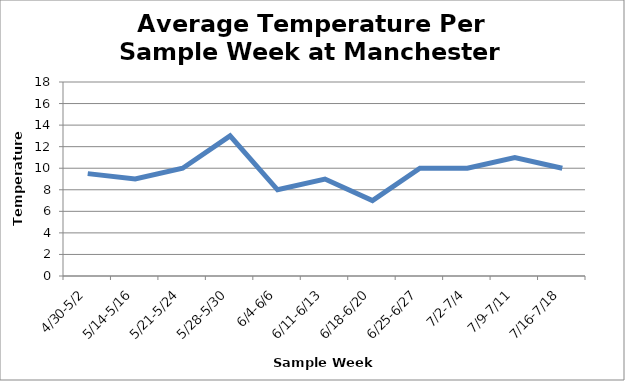
| Category | Manchester |
|---|---|
| 4/30-5/2 | 9.5 |
| 5/14-5/16 | 9 |
| 5/21-5/24 | 10 |
| 5/28-5/30 | 13 |
| 6/4-6/6 | 8 |
| 6/11-6/13 | 9 |
| 6/18-6/20 | 7 |
| 6/25-6/27 | 10 |
| 7/2-7/4 | 10 |
| 7/9-7/11 | 11 |
| 7/16-7/18 | 10 |